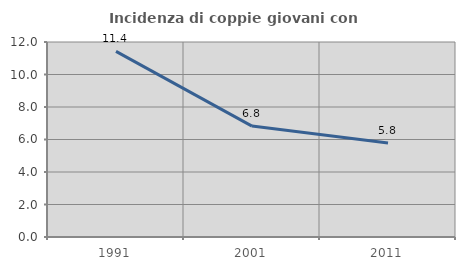
| Category | Incidenza di coppie giovani con figli |
|---|---|
| 1991.0 | 11.42 |
| 2001.0 | 6.826 |
| 2011.0 | 5.792 |